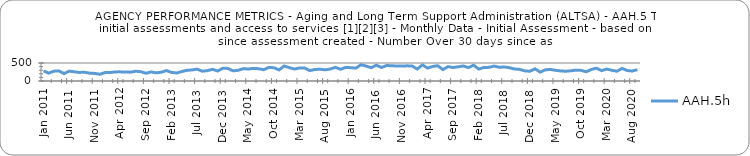
| Category | AAH.5h |
|---|---|
| 2011-01-01 | 280 |
| 2011-02-01 | 218 |
| 2011-03-01 | 273 |
| 2011-04-01 | 280 |
| 2011-05-01 | 205 |
| 2011-06-01 | 274 |
| 2011-07-01 | 255 |
| 2011-08-01 | 238 |
| 2011-09-01 | 243 |
| 2011-10-01 | 218 |
| 2011-11-01 | 210 |
| 2011-12-01 | 188 |
| 2012-01-01 | 233 |
| 2012-02-01 | 234 |
| 2012-03-01 | 253 |
| 2012-04-01 | 254 |
| 2012-05-01 | 248 |
| 2012-06-01 | 246 |
| 2012-07-01 | 271 |
| 2012-08-01 | 258 |
| 2012-09-01 | 215 |
| 2012-10-01 | 251 |
| 2012-11-01 | 226 |
| 2012-12-01 | 244 |
| 2013-01-01 | 290 |
| 2013-02-01 | 238 |
| 2013-03-01 | 223 |
| 2013-04-01 | 263 |
| 2013-05-01 | 296 |
| 2013-06-01 | 307 |
| 2013-07-01 | 330 |
| 2013-08-01 | 272 |
| 2013-09-01 | 288 |
| 2013-10-01 | 324 |
| 2013-11-01 | 277 |
| 2013-12-01 | 353 |
| 2014-01-01 | 350 |
| 2014-02-01 | 282 |
| 2014-03-01 | 297 |
| 2014-04-01 | 344 |
| 2014-05-01 | 332 |
| 2014-06-01 | 351 |
| 2014-07-01 | 341 |
| 2014-08-01 | 313 |
| 2014-09-01 | 378 |
| 2014-10-01 | 369 |
| 2014-11-01 | 308 |
| 2014-12-01 | 417 |
| 2015-01-01 | 370 |
| 2015-02-01 | 333 |
| 2015-03-01 | 362 |
| 2015-04-01 | 362 |
| 2015-05-01 | 290 |
| 2015-06-01 | 320 |
| 2015-07-01 | 326 |
| 2015-08-01 | 311 |
| 2015-09-01 | 332 |
| 2015-10-01 | 379 |
| 2015-11-01 | 326 |
| 2015-12-01 | 377 |
| 2016-01-01 | 370 |
| 2016-02-01 | 358 |
| 2016-03-01 | 451 |
| 2016-04-01 | 414 |
| 2016-05-01 | 370 |
| 2016-06-01 | 439 |
| 2016-07-01 | 376 |
| 2016-08-01 | 429 |
| 2016-09-01 | 425 |
| 2016-10-01 | 415 |
| 2016-11-01 | 415 |
| 2016-12-01 | 421 |
| 2017-01-01 | 416 |
| 2017-02-01 | 332 |
| 2017-03-01 | 447 |
| 2017-04-01 | 358 |
| 2017-05-01 | 403 |
| 2017-06-01 | 425 |
| 2017-07-01 | 316 |
| 2017-08-01 | 399 |
| 2017-09-01 | 374 |
| 2017-10-01 | 395 |
| 2017-11-01 | 416 |
| 2017-12-01 | 372 |
| 2018-01-01 | 440 |
| 2018-02-01 | 331 |
| 2018-03-01 | 376 |
| 2018-04-01 | 379 |
| 2018-05-01 | 415 |
| 2018-06-01 | 380 |
| 2018-07-01 | 390 |
| 2018-08-01 | 369 |
| 2018-09-01 | 333 |
| 2018-10-01 | 323 |
| 2018-11-01 | 281 |
| 2018-12-01 | 271 |
| 2019-01-01 | 338 |
| 2019-02-01 | 247 |
| 2019-03-01 | 311 |
| 2019-04-01 | 322 |
| 2019-05-01 | 296 |
| 2019-06-01 | 280 |
| 2019-07-01 | 271 |
| 2019-08-01 | 284 |
| 2019-09-01 | 301 |
| 2019-10-01 | 295 |
| 2019-11-01 | 256 |
| 2019-12-01 | 321 |
| 2020-01-01 | 355 |
| 2020-02-01 | 288 |
| 2020-03-01 | 332 |
| 2020-04-01 | 297 |
| 2020-05-01 | 272 |
| 2020-06-01 | 350 |
| 2020-07-01 | 290 |
| 2020-08-01 | 278 |
| 2020-09-01 | 315 |